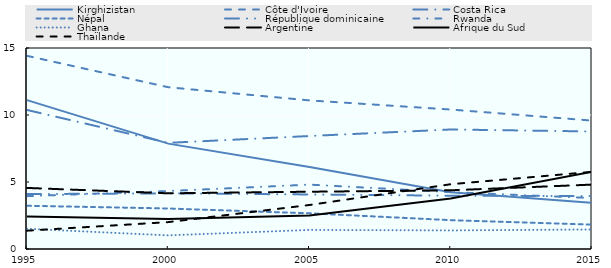
| Category | Kirghizistan | Côte d'Ivoire | Costa Rica | Népal | République dominicaine | Rwanda | Ghana | Argentine | Afrique du Sud | Thaïlande |
|---|---|---|---|---|---|---|---|---|---|---|
| 1995.0 | 11.112 | 14.415 | 10.376 | 3.227 | 4.097 | 3.944 | 1.509 | 4.558 | 2.423 | 1.366 |
| 2000.0 | 7.862 | 12.073 | 7.921 | 3.024 | 4.153 | 4.327 | 1.018 | 4.156 | 2.231 | 2.006 |
| 2005.0 | 6.117 | 11.089 | 8.432 | 2.664 | 4.07 | 4.804 | 1.423 | 4.274 | 2.504 | 3.285 |
| 2010.0 | 4.237 | 10.407 | 8.919 | 2.153 | 3.978 | 4.243 | 1.386 | 4.381 | 3.764 | 4.834 |
| 2015.0 | 3.441 | 9.583 | 8.771 | 1.818 | 3.947 | 3.803 | 1.457 | 4.805 | 5.767 | 5.758 |